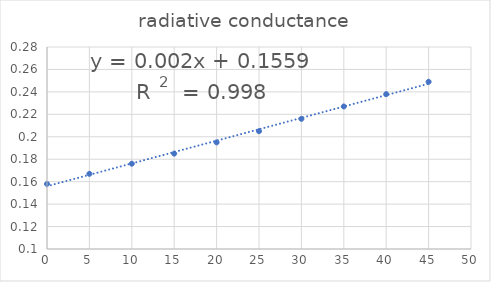
| Category | radiative conductance |
|---|---|
| 0.0 | 0.158 |
| 5.0 | 0.167 |
| 10.0 | 0.176 |
| 15.0 | 0.185 |
| 20.0 | 0.195 |
| 25.0 | 0.205 |
| 30.0 | 0.216 |
| 35.0 | 0.227 |
| 40.0 | 0.238 |
| 45.0 | 0.249 |